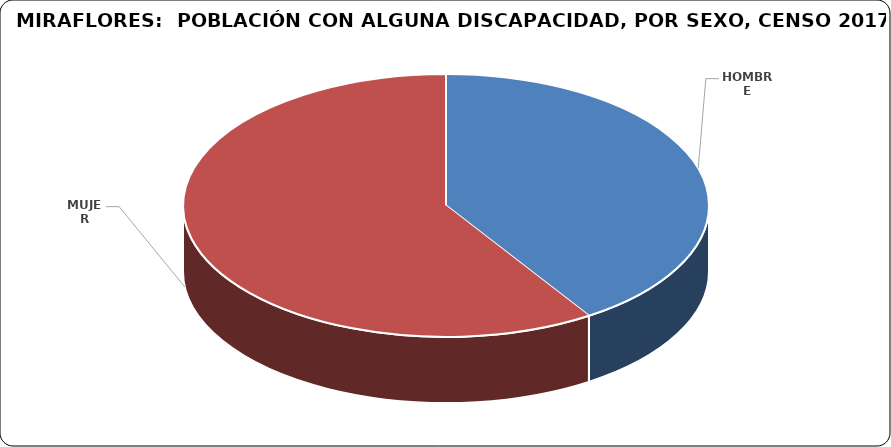
| Category | Series 0 |
|---|---|
| HOMBRE | 4466 |
| MUJER | 6465 |